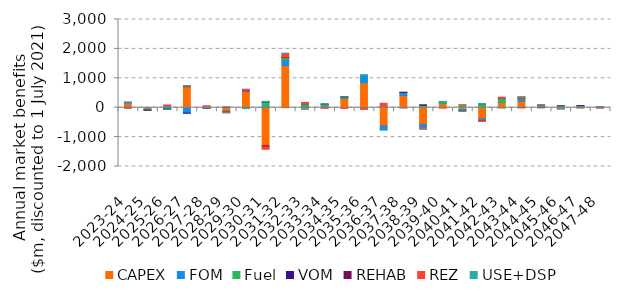
| Category | CAPEX | FOM | Fuel | VOM | REHAB | REZ | USE+DSP |
|---|---|---|---|---|---|---|---|
| 2023-24 | 152.623 | 24.607 | -3.95 | -0.508 | 0 | 13.072 | 2.493 |
| 2024-25 | -73.346 | -11.642 | -0.203 | -0.028 | 0 | 0.421 | 0.899 |
| 2025-26 | -37.578 | 72.396 | -10.895 | -0.127 | -4.147 | 22.515 | -0.833 |
| 2026-27 | 714.874 | -183.666 | 2.158 | -2.636 | 16.07 | 13.919 | 0.331 |
| 2027-28 | 10.262 | 12.674 | -7.21 | -2.606 | -0.503 | 43.717 | -0.794 |
| 2028-29 | -119.212 | -30.748 | 17.712 | -1.602 | 1.54 | -20.651 | -1.785 |
| 2029-30 | 550.883 | 28.956 | -11.902 | -4.963 | 11.318 | 37.635 | -14.07 |
| 2030-31 | -1298.231 | 51.547 | 144.783 | 7.114 | -36.43 | -79.719 | 12.628 |
| 2031-32 | 1438.476 | 201.895 | 63.942 | 0.715 | 14.924 | 130.315 | 0.121 |
| 2032-33 | -47.606 | 65.4 | 70.891 | 2.087 | 0.001 | 43.52 | -0.147 |
| 2033-34 | 0.758 | 53.577 | 62.806 | 3.099 | 0 | -23.067 | 0.072 |
| 2034-35 | 307.817 | 8.929 | 45.24 | 3.274 | 0 | -23.004 | 0.796 |
| 2035-36 | 848.649 | 261.363 | 1.656 | -0.626 | 0 | -56.634 | 1.961 |
| 2036-37 | -620.427 | -135.704 | 37.326 | 1.07 | 0 | 111.447 | -0.032 |
| 2037-38 | 410.75 | 96.19 | 13.614 | 0.998 | 0 | -5.263 | -0.03 |
| 2038-39 | -563.299 | -116.598 | 87.728 | 1.214 | 0 | -50.77 | -0.004 |
| 2039-40 | 148.547 | 7.482 | 55.681 | 0.151 | 0 | -8.194 | 3.009 |
| 2040-41 | -68.807 | -35.577 | 94.407 | -1.535 | 0 | 4.954 | -0.187 |
| 2041-42 | -376.967 | -71.63 | 136.528 | 2.858 | 0 | -15.492 | 3.513 |
| 2042-43 | 178.227 | 8.773 | 137.8 | 0.817 | 0 | 31.301 | -0.004 |
| 2043-44 | 220.129 | 68.522 | 31.013 | 1.634 | 0 | 51.008 | 2.885 |
| 2044-45 | 38.812 | 7.715 | 40.198 | 1.031 | 0 | 13.615 | 0.444 |
| 2045-46 | -26.603 | -4.454 | 63.423 | 0.134 | 0 | -7.76 | -0.038 |
| 2046-47 | 37.449 | 6.288 | 24.908 | 1.018 | 0 | -0.545 | -0.004 |
| 2047-48 | -1.734 | 4.777 | 26.647 | 0.751 | 0 | -6.263 | 0.005 |